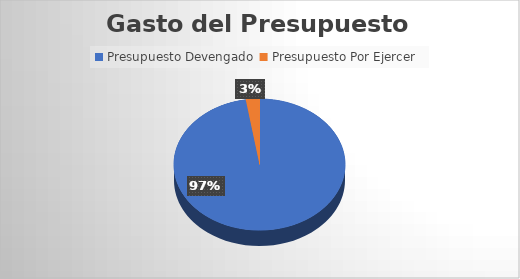
| Category | Monto  |
|---|---|
| Presupuesto Devengado  | 28397026.01 |
| Presupuesto Por Ejercer  | 750647.32 |